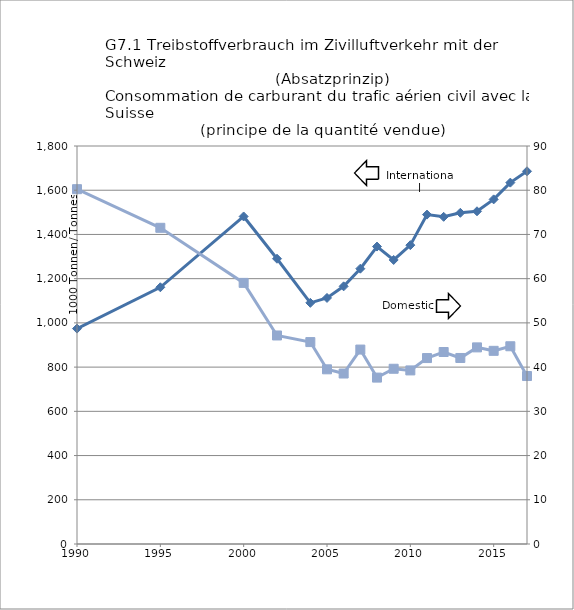
| Category | International |
|---|---|
| 1990.0 | 974.211 |
| 1995.0 | 1161.044 |
| 2000.0 | 1481.262 |
| 2002.0 | 1290.115 |
| 2004.0 | 1090.689 |
| 2005.0 | 1112.887 |
| 2006.0 | 1165.318 |
| 2007.0 | 1245.184 |
| 2008.0 | 1345.209 |
| 2009.0 | 1284.598 |
| 2010.0 | 1351.572 |
| 2011.0 | 1489.758 |
| 2012.0 | 1479.702 |
| 2013.0 | 1497.899 |
| 2014.0 | 1504.767 |
| 2015.0 | 1558.639 |
| 2016.0 | 1634.318 |
| 2017.0 | 1685.732 |